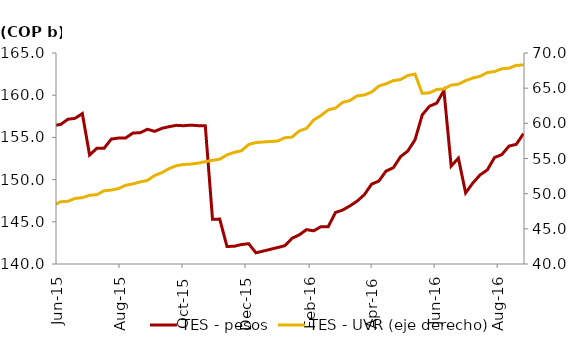
| Category | TES - pesos |
|---|---|
| 2013-04-26 | 124.383 |
| 2013-05-03 | 124.474 |
| 2013-05-10 | 124.672 |
| 2013-05-17 | 125.363 |
| 2013-05-24 | 125.442 |
| 2013-05-31 | 125.102 |
| 2013-06-07 | 125.28 |
| 2013-06-14 | 125.831 |
| 2013-06-21 | 126.248 |
| 2013-06-28 | 124.984 |
| 2013-07-05 | 124.113 |
| 2013-07-12 | 125.588 |
| 2013-07-19 | 126.161 |
| 2013-07-26 | 127.979 |
| 2013-08-02 | 128.596 |
| 2013-08-09 | 129.167 |
| 2013-08-16 | 129.917 |
| 2013-08-23 | 130.304 |
| 2013-08-30 | 131.294 |
| 2013-09-06 | 131.984 |
| 2013-09-13 | 132.907 |
| 2013-09-20 | 133.141 |
| 2013-09-27 | 134.454 |
| 2013-10-04 | 134.017 |
| 2013-10-11 | 134.845 |
| 2013-10-18 | 135.047 |
| 2013-10-25 | 136.465 |
| 2013-11-01 | 135.918 |
| 2013-11-08 | 136.906 |
| 2013-11-15 | 132.899 |
| 2013-11-22 | 133.382 |
| 2013-11-29 | 133.879 |
| 2013-12-06 | 134.148 |
| 2013-12-13 | 134.349 |
| 2013-12-20 | 134.683 |
| 2013-12-27 | 134.882 |
| 2014-01-03 | 134.882 |
| 2014-01-10 | 135.948 |
| 2014-01-17 | 134.954 |
| 2014-01-24 | 136.197 |
| 2014-01-31 | 136.785 |
| 2014-02-07 | 136.842 |
| 2014-02-14 | 137.345 |
| 2014-02-21 | 137.395 |
| 2014-02-28 | 137.984 |
| 2014-03-07 | 138.167 |
| 2014-03-14 | 138.684 |
| 2014-03-21 | 139.629 |
| 2014-03-28 | 140.76 |
| 2014-04-04 | 141.28 |
| 2014-04-11 | 143.127 |
| 2014-04-18 | 143.128 |
| 2014-04-25 | 143.191 |
| 2014-05-02 | 144.248 |
| 2014-05-09 | 144.4 |
| 2014-05-16 | 135.674 |
| 2014-05-23 | 135.776 |
| 2014-05-30 | 136.892 |
| 2014-06-06 | 136.935 |
| 2014-06-13 | 138.633 |
| 2014-06-20 | 138.904 |
| 2014-06-27 | 139.537 |
| 2014-07-04 | 136.361 |
| 2014-07-11 | 137.638 |
| 2014-07-18 | 138.048 |
| 2014-07-25 | 139.318 |
| 2014-08-01 | 139.749 |
| 2014-08-08 | 140.326 |
| 2014-08-15 | 141.069 |
| 2014-08-22 | 141.231 |
| 2014-08-29 | 142.588 |
| 2014-09-05 | 142.89 |
| 2014-09-12 | 138.264 |
| 2014-09-19 | 138.98 |
| 2014-09-26 | 139.583 |
| 2014-10-03 | 140.179 |
| 2014-10-10 | 141.078 |
| 2014-10-17 | 142.006 |
| 2014-10-24 | 142.916 |
| 2014-10-31 | 143.646 |
| 2014-11-07 | 144.225 |
| 2014-11-14 | 143.051 |
| 2014-11-21 | 143.685 |
| 2014-11-28 | 143.879 |
| 2014-12-05 | 143.97 |
| 2014-12-12 | 144.028 |
| 2014-12-19 | 144.043 |
| 2014-12-26 | 144.095 |
| 2015-01-02 | 144.245 |
| 2015-01-09 | 144.455 |
| 2015-01-16 | 145.114 |
| 2015-01-23 | 145.219 |
| 2015-01-30 | 146.676 |
| 2015-02-06 | 146.836 |
| 2015-02-13 | 147.563 |
| 2015-02-20 | 147.604 |
| 2015-02-27 | 148.762 |
| 2015-03-06 | 148.897 |
| 2015-03-13 | 149.684 |
| 2015-03-20 | 149.971 |
| 2015-03-27 | 151.297 |
| 2015-04-03 | 151.319 |
| 2015-04-10 | 151.74 |
| 2015-04-17 | 152.442 |
| 2015-04-24 | 153.316 |
| 2015-05-01 | 154.564 |
| 2015-05-08 | 154.994 |
| 2015-05-15 | 155.622 |
| 2015-05-22 | 155.648 |
| 2015-05-29 | 156.411 |
| 2015-06-05 | 156.528 |
| 2015-06-12 | 157.151 |
| 2015-06-19 | 157.261 |
| 2015-06-26 | 157.821 |
| 2015-07-03 | 152.905 |
| 2015-07-10 | 153.712 |
| 2015-07-17 | 153.707 |
| 2015-07-24 | 154.798 |
| 2015-07-31 | 154.925 |
| 2015-08-07 | 154.937 |
| 2015-08-14 | 155.524 |
| 2015-08-21 | 155.55 |
| 2015-08-28 | 155.967 |
| 2015-09-04 | 155.715 |
| 2015-09-11 | 156.075 |
| 2015-09-18 | 156.271 |
| 2015-09-25 | 156.429 |
| 2015-10-02 | 156.382 |
| 2015-10-09 | 156.455 |
| 2015-10-16 | 156.392 |
| 2015-10-23 | 156.368 |
| 2015-10-30 | 145.299 |
| 2015-11-06 | 145.32 |
| 2015-11-13 | 142.074 |
| 2015-11-20 | 142.102 |
| 2015-11-27 | 142.306 |
| 2015-12-04 | 142.408 |
| 2015-12-11 | 141.326 |
| 2015-12-18 | 141.529 |
| 2015-12-25 | 141.735 |
| 2016-01-01 | 141.95 |
| 2016-01-08 | 142.166 |
| 2016-01-15 | 143.046 |
| 2016-01-22 | 143.454 |
| 2016-01-29 | 144.073 |
| 2016-02-05 | 143.934 |
| 2016-02-12 | 144.423 |
| 2016-02-19 | 144.421 |
| 2016-02-26 | 146.101 |
| 2016-03-04 | 146.396 |
| 2016-03-11 | 146.883 |
| 2016-03-18 | 147.45 |
| 2016-03-25 | 148.22 |
| 2016-04-01 | 149.46 |
| 2016-04-08 | 149.83 |
| 2016-04-15 | 151.016 |
| 2016-04-22 | 151.405 |
| 2016-04-29 | 152.715 |
| 2016-05-06 | 153.387 |
| 2016-05-13 | 154.711 |
| 2016-05-20 | 157.668 |
| 2016-05-27 | 158.694 |
| 2016-06-03 | 159.057 |
| 2016-06-10 | 160.549 |
| 2016-06-17 | 151.599 |
| 2016-06-24 | 152.542 |
| 2016-07-01 | 148.423 |
| 2016-07-08 | 149.596 |
| 2016-07-15 | 150.555 |
| 2016-07-22 | 151.148 |
| 2016-07-29 | 152.617 |
| 2016-08-05 | 152.958 |
| 2016-08-12 | 153.973 |
| 2016-08-19 | 154.176 |
| 2016-08-26 | 155.449 |